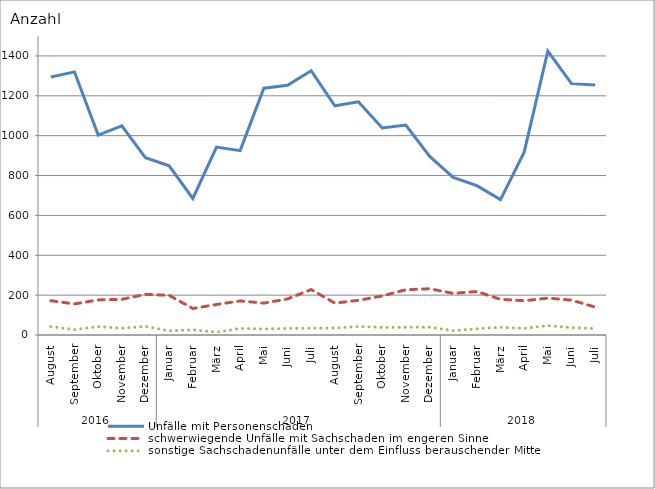
| Category | Unfälle mit Personenschaden | schwerwiegende Unfälle mit Sachschaden im engeren Sinne | sonstige Sachschadenunfälle unter dem Einfluss berauschender Mittel |
|---|---|---|---|
| 0 | 1294 | 172 | 42 |
| 1 | 1320 | 156 | 27 |
| 2 | 1003 | 176 | 42 |
| 3 | 1049 | 179 | 34 |
| 4 | 889 | 204 | 43 |
| 5 | 849 | 199 | 21 |
| 6 | 685 | 133 | 26 |
| 7 | 943 | 153 | 14 |
| 8 | 925 | 171 | 33 |
| 9 | 1238 | 160 | 30 |
| 10 | 1253 | 181 | 33 |
| 11 | 1326 | 228 | 34 |
| 12 | 1150 | 160 | 35 |
| 13 | 1170 | 174 | 43 |
| 14 | 1039 | 196 | 38 |
| 15 | 1053 | 227 | 39 |
| 16 | 897 | 232 | 39 |
| 17 | 791 | 209 | 22 |
| 18 | 749 | 218 | 31 |
| 19 | 679 | 179 | 39 |
| 20 | 917 | 172 | 33 |
| 21 | 1424 | 185 | 47 |
| 22 | 1261 | 175 | 37 |
| 23 | 1254 | 140 | 32 |